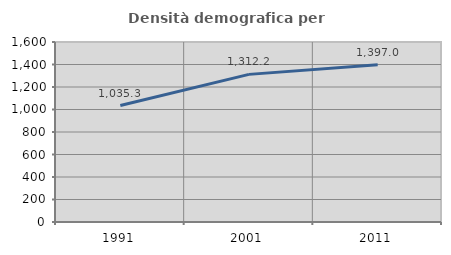
| Category | Densità demografica |
|---|---|
| 1991.0 | 1035.332 |
| 2001.0 | 1312.229 |
| 2011.0 | 1396.983 |